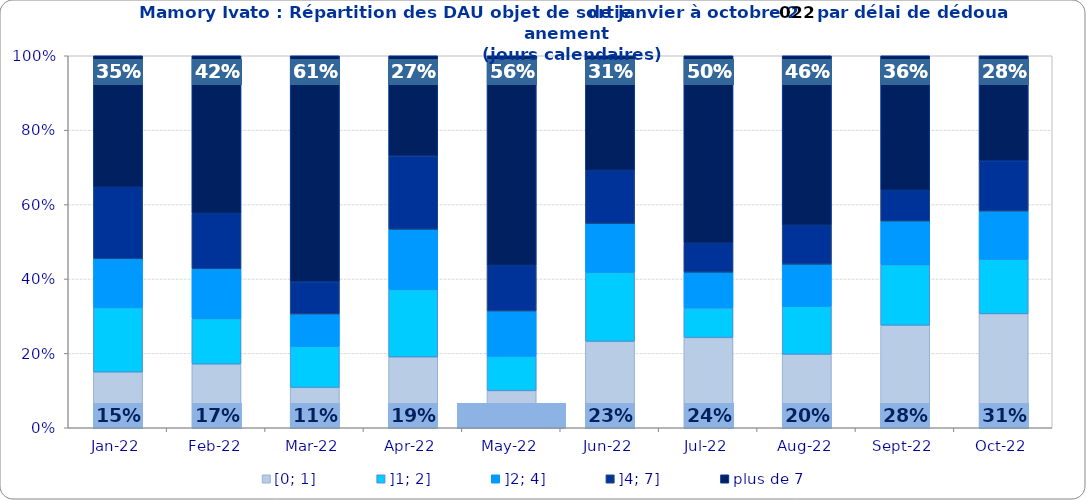
| Category | [0; 1] | ]1; 2] | ]2; 4] | ]4; 7] | plus de 7 |
|---|---|---|---|---|---|
| 2022-01-01 | 0.15 | 0.173 | 0.131 | 0.192 | 0.354 |
| 2022-02-01 | 0.171 | 0.122 | 0.134 | 0.149 | 0.423 |
| 2022-03-01 | 0.108 | 0.111 | 0.087 | 0.086 | 0.608 |
| 2022-04-01 | 0.19 | 0.182 | 0.162 | 0.197 | 0.27 |
| 2022-05-01 | 0.1 | 0.093 | 0.121 | 0.123 | 0.563 |
| 2022-06-01 | 0.232 | 0.186 | 0.131 | 0.143 | 0.308 |
| 2022-07-01 | 0.242 | 0.08 | 0.096 | 0.078 | 0.504 |
| 2022-08-01 | 0.198 | 0.129 | 0.113 | 0.105 | 0.455 |
| 2022-09-01 | 0.276 | 0.163 | 0.117 | 0.083 | 0.362 |
| 2022-10-01 | 0.306 | 0.147 | 0.129 | 0.135 | 0.282 |